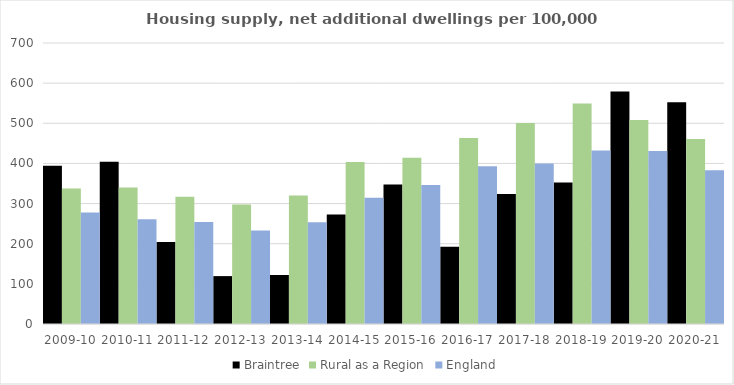
| Category | Braintree | Rural as a Region | England |
|---|---|---|---|
| 2009-10 | 393.944 | 337.852 | 277.548 |
| 2010-11 | 403.913 | 340.105 | 260.994 |
| 2011-12 | 204.048 | 317.04 | 254.007 |
| 2012-13 | 119.292 | 297.763 | 233.153 |
| 2013-14 | 122.025 | 319.835 | 253.602 |
| 2014-15 | 272.529 | 403.796 | 314.256 |
| 2015-16 | 347.439 | 414.091 | 346.154 |
| 2016-17 | 192.418 | 463.209 | 393.256 |
| 2017-18 | 323.714 | 500.68 | 399.646 |
| 2018-19 | 352.333 | 549.491 | 432.099 |
| 2019-20 | 579.277 | 508.493 | 431.187 |
| 2020-21 | 552.612 | 461.114 | 382.827 |